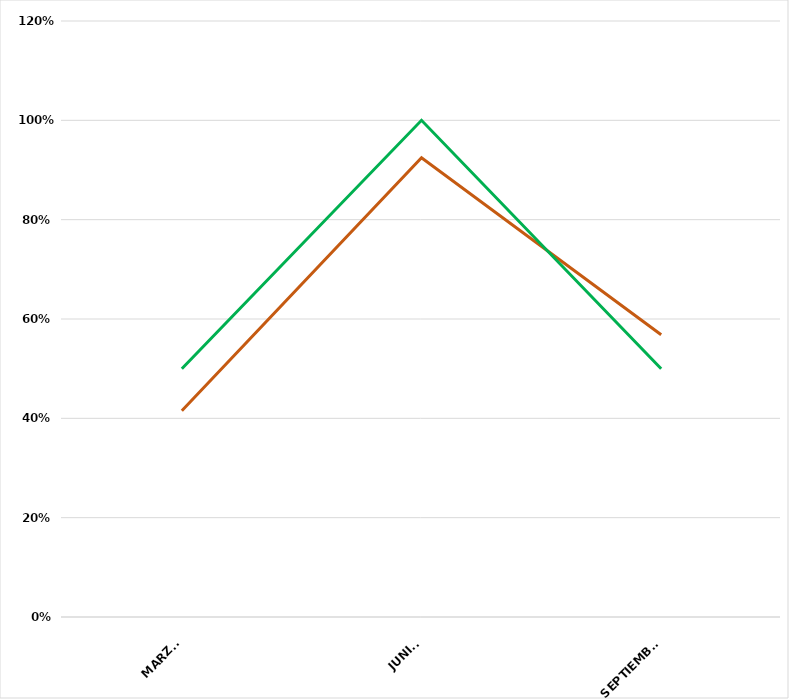
| Category | VALOR  | META PONDERADA |
|---|---|---|
| MARZO | 0.415 | 0.5 |
| JUNIO | 0.925 | 1 |
| SEPTIEMBRE | 0.568 | 0.5 |